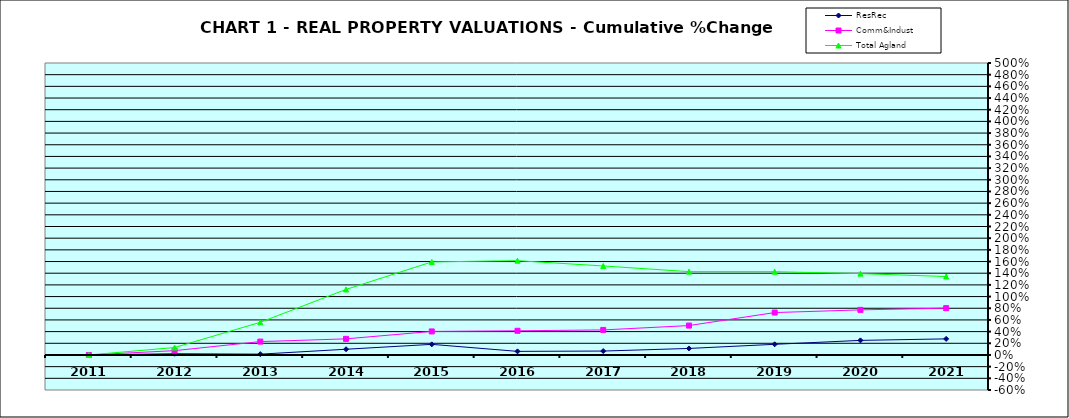
| Category | ResRec | Comm&Indust | Total Agland |
|---|---|---|---|
| 2011.0 | 0 | 0 | 0 |
| 2012.0 | 0.021 | 0.074 | 0.127 |
| 2013.0 | 0.014 | 0.229 | 0.559 |
| 2014.0 | 0.098 | 0.276 | 1.122 |
| 2015.0 | 0.182 | 0.403 | 1.594 |
| 2016.0 | 0.062 | 0.414 | 1.615 |
| 2017.0 | 0.067 | 0.429 | 1.524 |
| 2018.0 | 0.112 | 0.503 | 1.427 |
| 2019.0 | 0.183 | 0.726 | 1.426 |
| 2020.0 | 0.25 | 0.772 | 1.393 |
| 2021.0 | 0.275 | 0.802 | 1.343 |